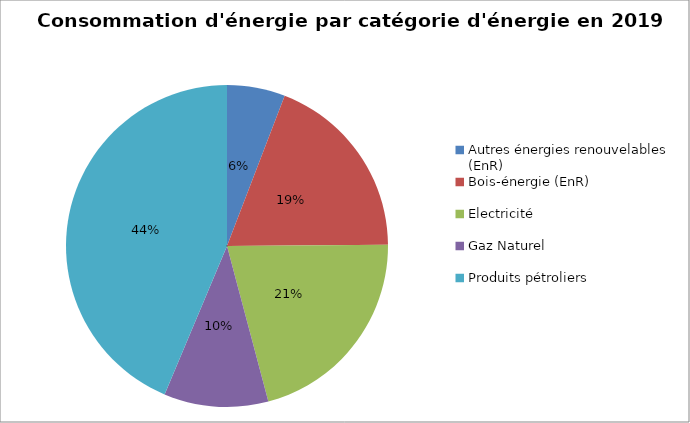
| Category | Series 0 |
|---|---|
| Autres énergies renouvelables (EnR) | 12525.243 |
| Bois-énergie (EnR) | 40866.309 |
| Electricité | 45054.065 |
| Gaz Naturel | 22476.962 |
| Produits pétroliers | 93719.143 |